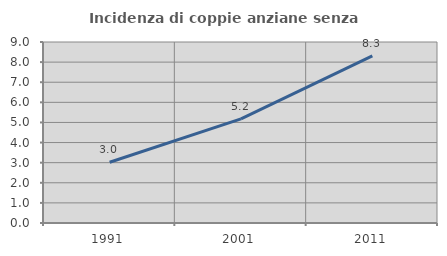
| Category | Incidenza di coppie anziane senza figli  |
|---|---|
| 1991.0 | 3.02 |
| 2001.0 | 5.177 |
| 2011.0 | 8.315 |